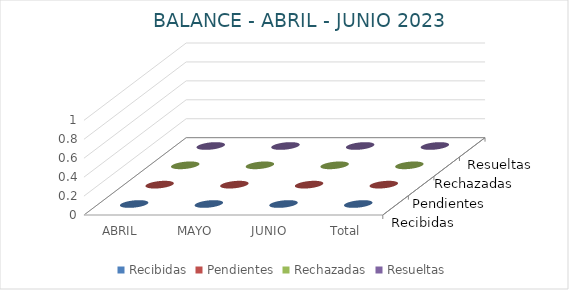
| Category | Recibidas | Pendientes | Rechazadas | Resueltas |
|---|---|---|---|---|
| ABRIL | 0 | 0 | 0 | 0 |
| MAYO | 0 | 0 | 0 | 0 |
| JUNIO | 0 | 0 | 0 | 0 |
| Total general | 0 | 0 | 0 | 0 |